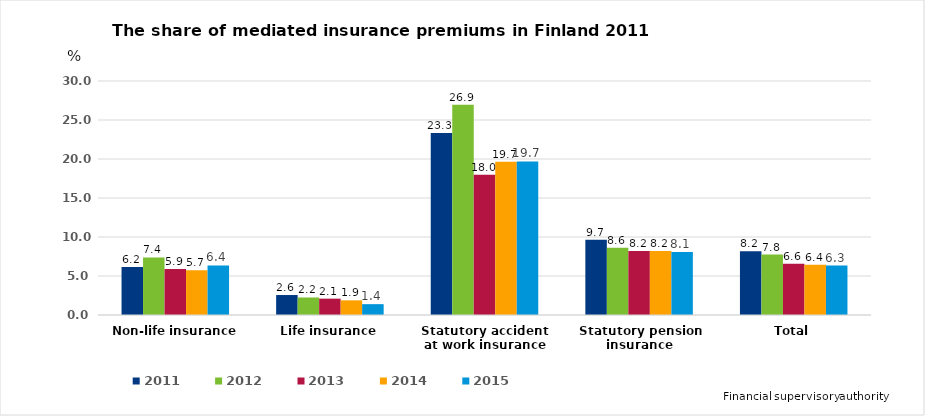
| Category | 2011 | 2012 | 2013 | 2014 | 2015 |
|---|---|---|---|---|---|
| Non-life insurance | 6.168 | 7.375 | 5.882 | 5.737 | 6.356 |
| Life insurance | 2.56 | 2.246 | 2.097 | 1.88 | 1.39 |
| Statutory accident at work insurance | 23.324 | 26.944 | 17.98 | 19.654 | 19.692 |
| Statutory pension insurance | 9.661 | 8.637 | 8.204 | 8.203 | 8.075 |
| Total | 8.167 | 7.754 | 6.584 | 6.436 | 6.337 |